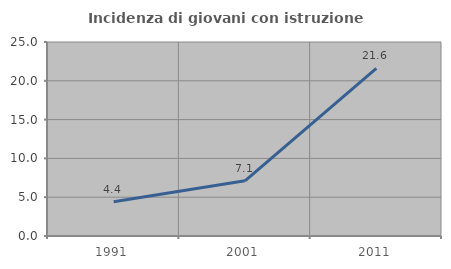
| Category | Incidenza di giovani con istruzione universitaria |
|---|---|
| 1991.0 | 4.412 |
| 2001.0 | 7.111 |
| 2011.0 | 21.598 |